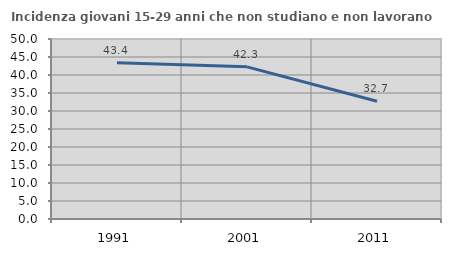
| Category | Incidenza giovani 15-29 anni che non studiano e non lavorano  |
|---|---|
| 1991.0 | 43.396 |
| 2001.0 | 42.262 |
| 2011.0 | 32.727 |